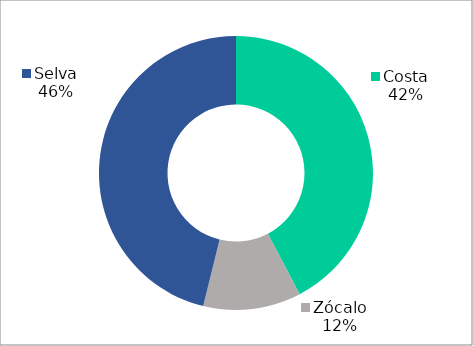
| Category | Series 0 |
|---|---|
| Costa | 11 |
| Zócalo | 3 |
| Selva | 12 |